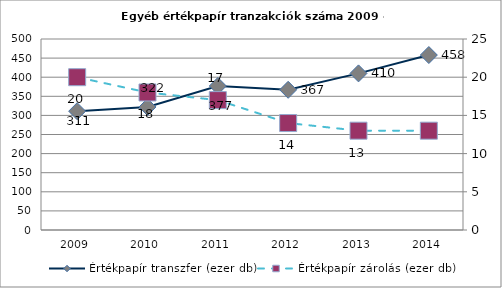
| Category | Értékpapír transzfer (ezer db) |
|---|---|
| 2009.0 | 311 |
| 2010.0 | 322 |
| 2011.0 | 377 |
| 2012.0 | 367 |
| 2013.0 | 410 |
| 2014.0 | 458 |